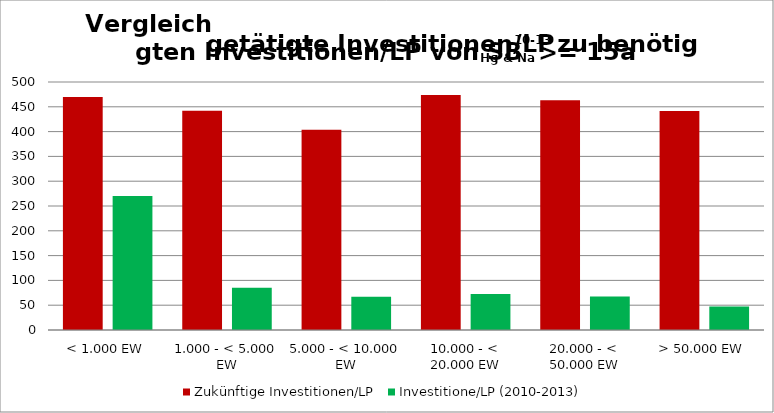
| Category | Zukünftige Investitionen/LP | Investitione/LP (2010-2013) |
|---|---|---|
| < 1.000 EW | 469.73 | 270.213 |
| 1.000 - < 5.000 EW | 442.143 | 85.428 |
| 5.000 - < 10.000 EW | 403.913 | 67.19 |
| 10.000 - < 20.000 EW | 473.571 | 72.411 |
| 20.000 - < 50.000 EW | 463 | 67.513 |
| > 50.000 EW | 441.667 | 47.159 |